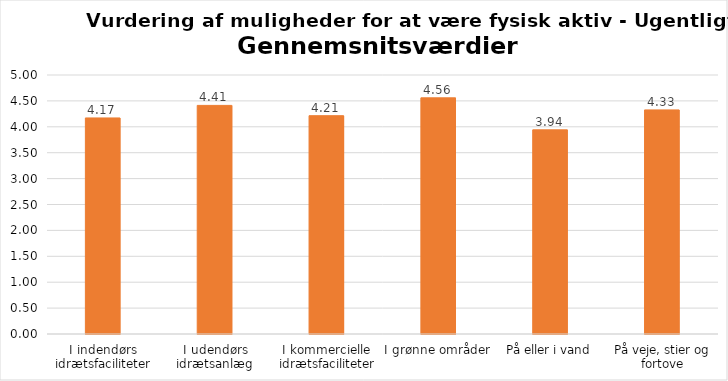
| Category | Gennemsnit |
|---|---|
| I indendørs idrætsfaciliteter | 4.171 |
| I udendørs idrætsanlæg | 4.413 |
| I kommercielle idrætsfaciliteter | 4.214 |
| I grønne områder | 4.559 |
| På eller i vand | 3.941 |
| På veje, stier og fortove | 4.326 |